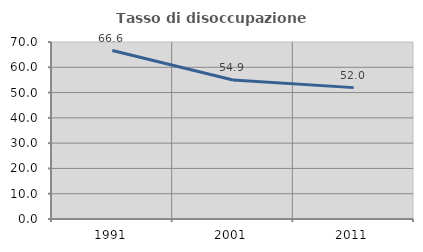
| Category | Tasso di disoccupazione giovanile  |
|---|---|
| 1991.0 | 66.623 |
| 2001.0 | 54.94 |
| 2011.0 | 51.955 |